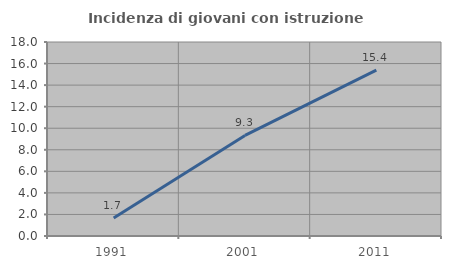
| Category | Incidenza di giovani con istruzione universitaria |
|---|---|
| 1991.0 | 1.667 |
| 2001.0 | 9.333 |
| 2011.0 | 15.385 |